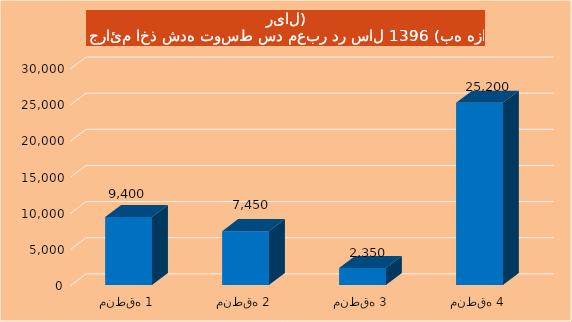
| Category | Series 0 |
|---|---|
| منطقه 1 | 9400 |
| منطقه 2 | 7450 |
| منطقه 3 | 2350 |
| منطقه 4 | 25200 |